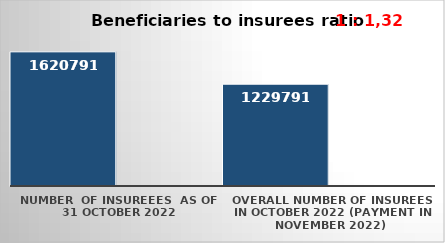
| Category | Series 0 | Series 1 |
|---|---|---|
| NUMBER  of insureees  as of  31 October 2022 | 1620791 |  |
| OVERALL number of insurees in October 2022 (payment in November 2022) | 1229791 |  |